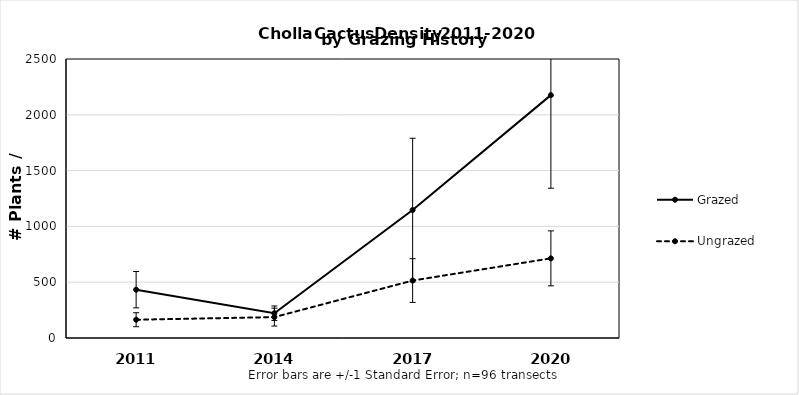
| Category | Grazed | Ungrazed |
|---|---|---|
| 2011.0 | 432.896 | 163.798 |
| 2014.0 | 222.298 | 187.198 |
| 2017.0 | 1146.589 | 514.795 |
| 2020.0 | 2176.18 | 713.693 |